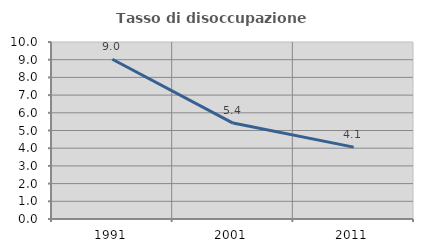
| Category | Tasso di disoccupazione giovanile  |
|---|---|
| 1991.0 | 9.025 |
| 2001.0 | 5.419 |
| 2011.0 | 4.061 |